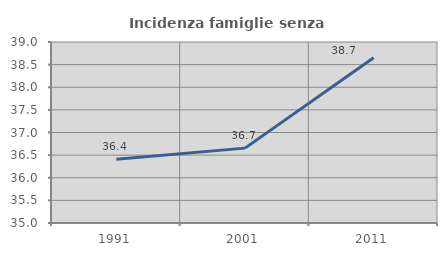
| Category | Incidenza famiglie senza nuclei |
|---|---|
| 1991.0 | 36.409 |
| 2001.0 | 36.655 |
| 2011.0 | 38.653 |